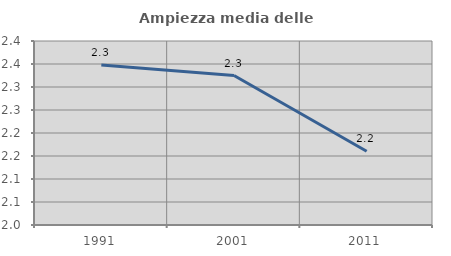
| Category | Ampiezza media delle famiglie |
|---|---|
| 1991.0 | 2.348 |
| 2001.0 | 2.325 |
| 2011.0 | 2.16 |